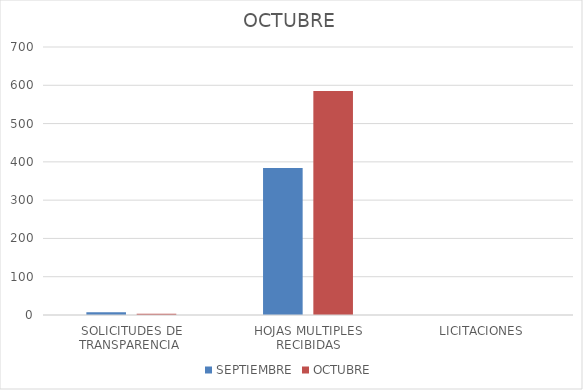
| Category | SEPTIEMBRE | OCTUBRE |
|---|---|---|
| SOLICITUDES DE TRANSPARENCIA  | 7 | 3 |
| HOJAS MULTIPLES RECIBIDAS | 384 | 585 |
| LICITACIONES  | 0 | 0 |